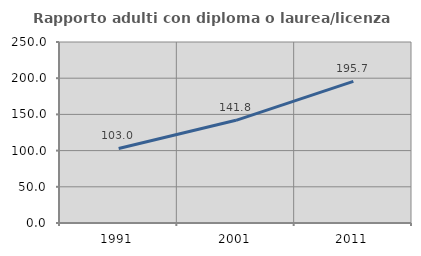
| Category | Rapporto adulti con diploma o laurea/licenza media  |
|---|---|
| 1991.0 | 103.01 |
| 2001.0 | 141.823 |
| 2011.0 | 195.69 |